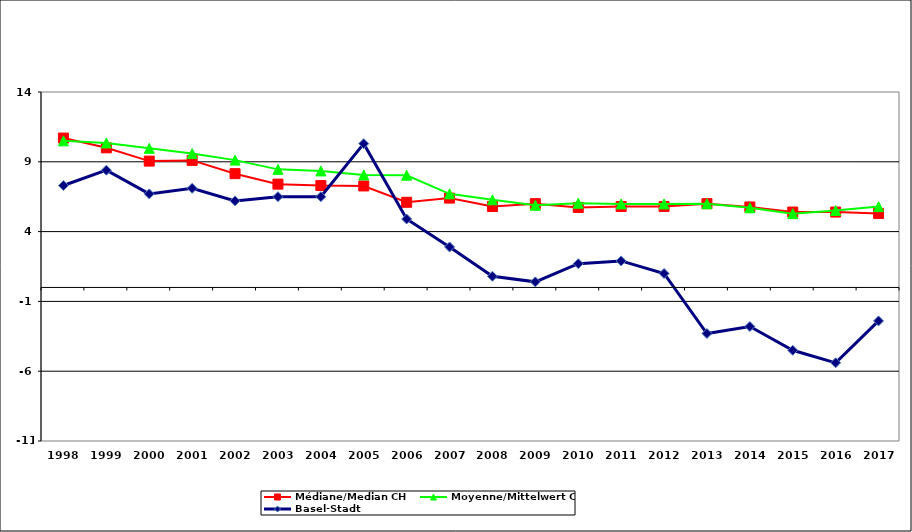
| Category | Médiane/Median CH | Moyenne/Mittelwert CH | Basel-Stadt |
|---|---|---|---|
| 1998.0 | 10.7 | 10.5 | 7.3 |
| 1999.0 | 10 | 10.35 | 8.4 |
| 2000.0 | 9.05 | 9.964 | 6.7 |
| 2001.0 | 9.1 | 9.588 | 7.1 |
| 2002.0 | 8.15 | 9.121 | 6.2 |
| 2003.0 | 7.4 | 8.458 | 6.5 |
| 2004.0 | 7.3 | 8.345 | 6.5 |
| 2005.0 | 7.27 | 8.061 | 10.3 |
| 2006.0 | 6.1 | 8.039 | 4.9 |
| 2007.0 | 6.4 | 6.706 | 2.9 |
| 2008.0 | 5.8 | 6.277 | 0.8 |
| 2009.0 | 6 | 5.883 | 0.4 |
| 2010.0 | 5.73 | 6.031 | 1.7 |
| 2011.0 | 5.8 | 5.983 | 1.9 |
| 2012.0 | 5.8 | 5.983 | 1 |
| 2013.0 | 6 | 5.994 | -3.3 |
| 2014.0 | 5.765 | 5.705 | -2.8 |
| 2015.0 | 5.4 | 5.288 | -4.5 |
| 2016.0 | 5.4 | 5.51 | -5.4 |
| 2017.0 | 5.3 | 5.792 | -2.4 |